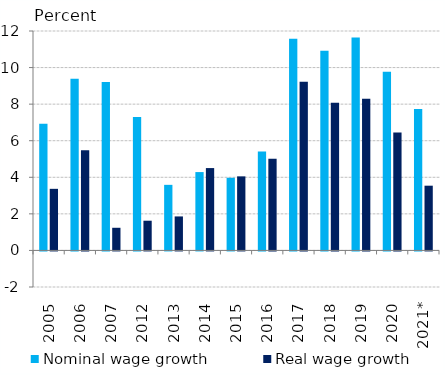
| Category | Nominal wage growth | Real wage growth |
|---|---|---|
| 2005 | 6.928 | 3.369 |
| 2006 | 9.392 | 5.472 |
| 2007 | 9.205 | 1.239 |
| 2012 | 7.295 | 1.625 |
| 2013 | 3.587 | 1.859 |
| 2014 | 4.285 | 4.504 |
| 2015 | 3.974 | 4.05 |
| 2016 | 5.413 | 5.017 |
| 2017 | 11.58 | 9.229 |
| 2018 | 10.913 | 8.079 |
| 2019 | 11.649 | 8.301 |
| 2020 | 9.778 | 6.443 |
| 2021* | 7.737 | 3.54 |